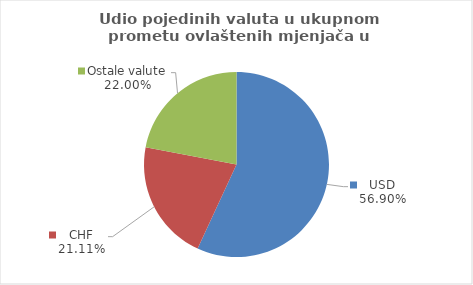
| Category | Series 0 |
|---|---|
| USD | 56.898 |
| CHF | 21.105 |
| Ostale valute | 21.997 |